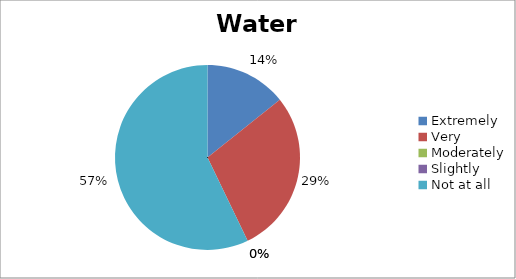
| Category | Water |
|---|---|
| Extremely | 1 |
| Very | 2 |
| Moderately | 0 |
| Slightly | 0 |
| Not at all | 4 |